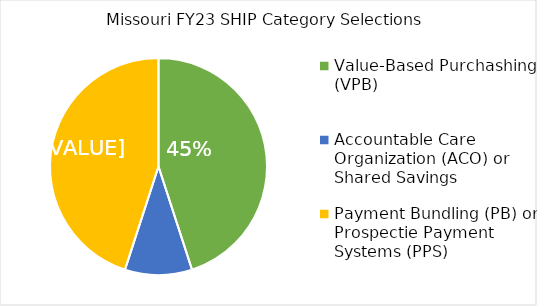
| Category | Series 0 |
|---|---|
| Value-Based Purchashing (VPB) | 0.45 |
| Accountable Care Organization (ACO) or Shared Savings | 0.1 |
| Payment Bundling (PB) or Prospectie Payment Systems (PPS) | 0.45 |